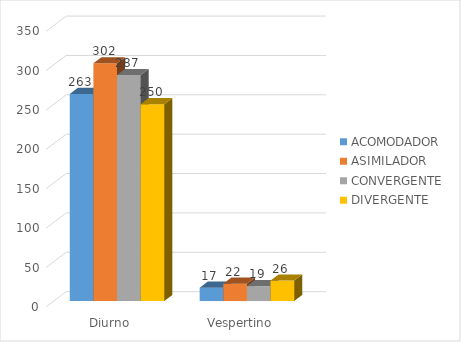
| Category | ACOMODADOR | ASIMILADOR | CONVERGENTE | DIVERGENTE |
|---|---|---|---|---|
| Diurno | 263 | 302 | 287 | 250 |
| Vespertino | 17 | 22 | 19 | 26 |